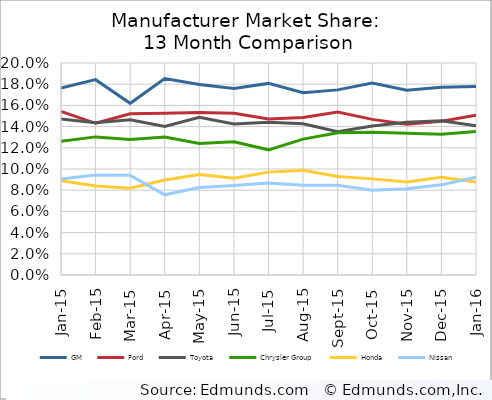
| Category | GM | Ford | Toyota | Chrysler Group | Honda | Nissan |
|---|---|---|---|---|---|---|
| 2015-01-01 | 0.176 | 0.154 | 0.147 | 0.126 | 0.089 | 0.091 |
| 2015-02-01 | 0.184 | 0.143 | 0.144 | 0.13 | 0.084 | 0.094 |
| 2015-03-01 | 0.162 | 0.152 | 0.146 | 0.128 | 0.082 | 0.094 |
| 2015-04-01 | 0.185 | 0.153 | 0.14 | 0.13 | 0.09 | 0.076 |
| 2015-05-01 | 0.18 | 0.153 | 0.149 | 0.124 | 0.095 | 0.083 |
| 2015-06-01 | 0.176 | 0.153 | 0.142 | 0.126 | 0.091 | 0.084 |
| 2015-07-01 | 0.181 | 0.147 | 0.144 | 0.118 | 0.097 | 0.087 |
| 2015-08-01 | 0.172 | 0.149 | 0.143 | 0.128 | 0.099 | 0.085 |
| 2015-09-01 | 0.175 | 0.154 | 0.135 | 0.134 | 0.093 | 0.085 |
| 2015-10-01 | 0.181 | 0.147 | 0.141 | 0.135 | 0.091 | 0.08 |
| 2015-11-01 | 0.174 | 0.142 | 0.144 | 0.134 | 0.088 | 0.081 |
| 2015-12-01 | 0.177 | 0.145 | 0.146 | 0.133 | 0.092 | 0.085 |
| 2016-01-01 | 0.178 | 0.151 | 0.141 | 0.135 | 0.088 | 0.092 |